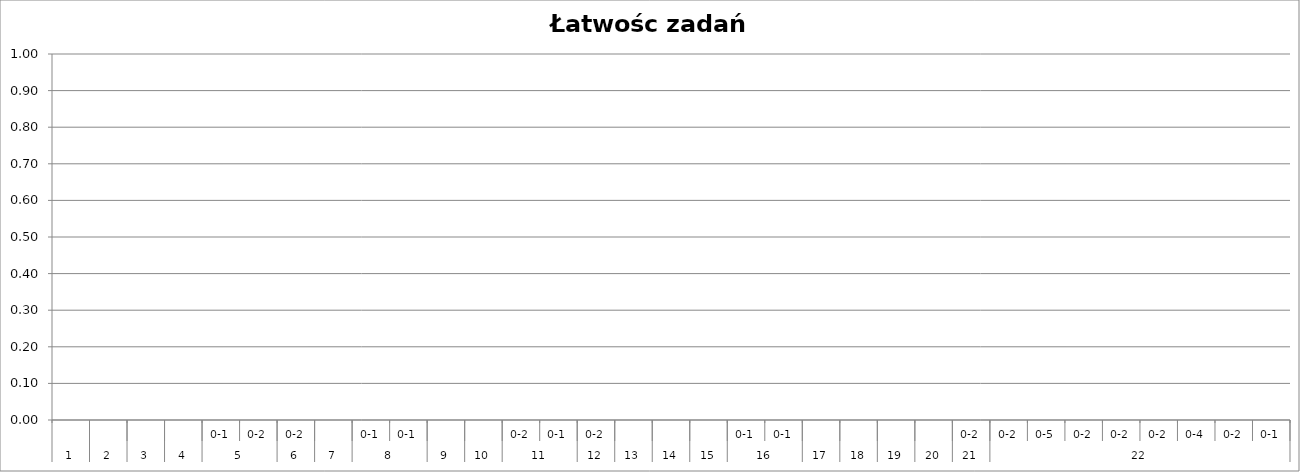
| Category | Series 0 |
|---|---|
| 0 | 0 |
| 1 | 0 |
| 2 | 0 |
| 3 | 0 |
| 4 | 0 |
| 5 | 0 |
| 6 | 0 |
| 7 | 0 |
| 8 | 0 |
| 9 | 0 |
| 10 | 0 |
| 11 | 0 |
| 12 | 0 |
| 13 | 0 |
| 14 | 0 |
| 15 | 0 |
| 16 | 0 |
| 17 | 0 |
| 18 | 0 |
| 19 | 0 |
| 20 | 0 |
| 21 | 0 |
| 22 | 0 |
| 23 | 0 |
| 24 | 0 |
| 25 | 0 |
| 26 | 0 |
| 27 | 0 |
| 28 | 0 |
| 29 | 0 |
| 30 | 0 |
| 31 | 0 |
| 32 | 0 |